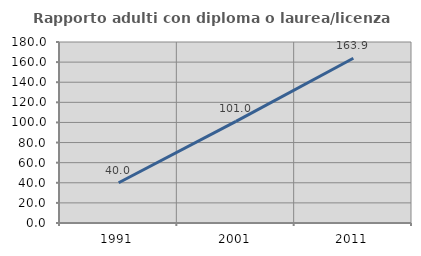
| Category | Rapporto adulti con diploma o laurea/licenza media  |
|---|---|
| 1991.0 | 40 |
| 2001.0 | 101.031 |
| 2011.0 | 163.855 |